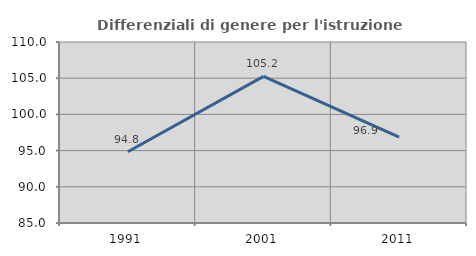
| Category | Differenziali di genere per l'istruzione superiore |
|---|---|
| 1991.0 | 94.84 |
| 2001.0 | 105.247 |
| 2011.0 | 96.865 |